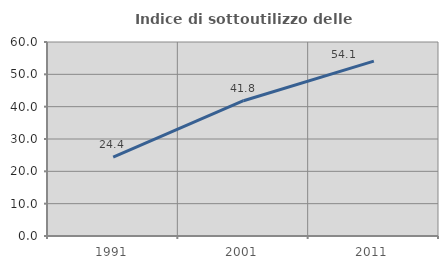
| Category | Indice di sottoutilizzo delle abitazioni  |
|---|---|
| 1991.0 | 24.399 |
| 2001.0 | 41.844 |
| 2011.0 | 54.104 |